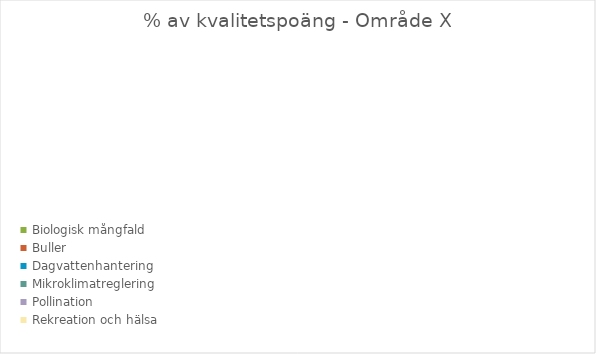
| Category | Series 0 |
|---|---|
| Biologisk mångfald  | 0 |
| Buller | 0 |
| Dagvattenhantering | 0 |
| Mikroklimatreglering | 0 |
| Pollination | 0 |
| Rekreation och hälsa | 0 |